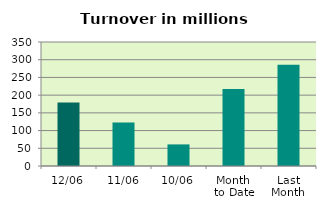
| Category | Series 0 |
|---|---|
| 12/06 | 179.321 |
| 11/06 | 122.476 |
| 10/06 | 60.968 |
| Month 
to Date | 217.602 |
| Last
Month | 285.992 |